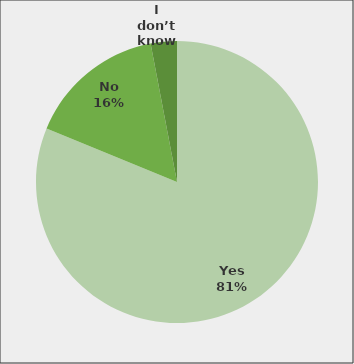
| Category | Series 0 |
|---|---|
| Yes | 0.812 |
| No | 0.158 |
| I don’t know | 0.03 |